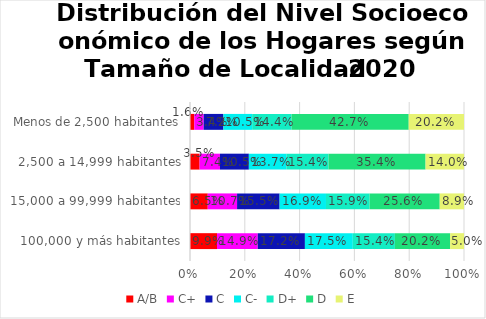
| Category | A/B | C+ | C | C- | D+ | D | E |
|---|---|---|---|---|---|---|---|
| 100,000 y más habitantes | 0.099 | 0.149 | 0.172 | 0.175 | 0.154 | 0.202 | 0.05 |
| 15,000 a 99,999 habitantes | 0.065 | 0.107 | 0.155 | 0.169 | 0.159 | 0.256 | 0.089 |
| 2,500 a 14,999 habitantes | 0.035 | 0.074 | 0.105 | 0.137 | 0.154 | 0.354 | 0.14 |
| Menos de 2,500 habitantes | 0.016 | 0.034 | 0.072 | 0.105 | 0.144 | 0.427 | 0.202 |